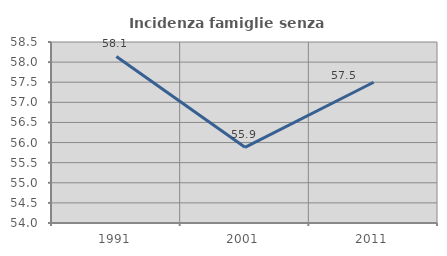
| Category | Incidenza famiglie senza nuclei |
|---|---|
| 1991.0 | 58.14 |
| 2001.0 | 55.882 |
| 2011.0 | 57.5 |